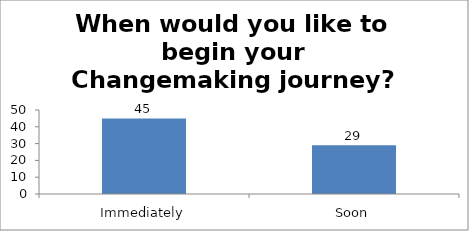
| Category | When would you like to begin your Changemaking journey?  |
|---|---|
| Immediately | 45 |
| Soon | 29 |